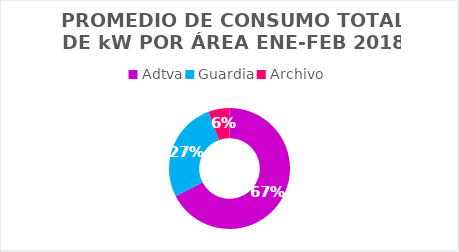
| Category | Series 0 |
|---|---|
| Adtva | 7820 |
| Guardia | 3122 |
| Archivo | 654 |